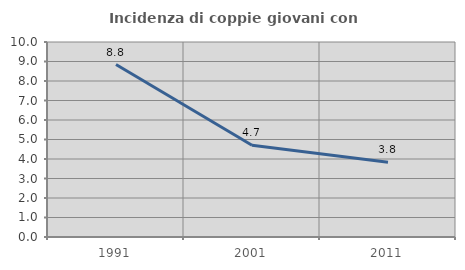
| Category | Incidenza di coppie giovani con figli |
|---|---|
| 1991.0 | 8.842 |
| 2001.0 | 4.704 |
| 2011.0 | 3.829 |